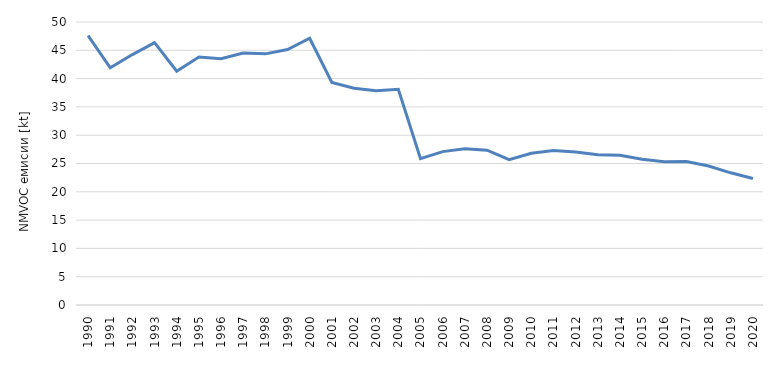
| Category | Series 0 |
|---|---|
| 1990.0 | 47.592 |
| 1991.0 | 41.908 |
| 1992.0 | 44.245 |
| 1993.0 | 46.352 |
| 1994.0 | 41.302 |
| 1995.0 | 43.832 |
| 1996.0 | 43.525 |
| 1997.0 | 44.525 |
| 1998.0 | 44.371 |
| 1999.0 | 45.133 |
| 2000.0 | 47.133 |
| 2001.0 | 39.307 |
| 2002.0 | 38.283 |
| 2003.0 | 37.852 |
| 2004.0 | 38.105 |
| 2005.0 | 25.856 |
| 2006.0 | 27.103 |
| 2007.0 | 27.622 |
| 2008.0 | 27.349 |
| 2009.0 | 25.686 |
| 2010.0 | 26.802 |
| 2011.0 | 27.313 |
| 2012.0 | 27.023 |
| 2013.0 | 26.539 |
| 2014.0 | 26.458 |
| 2015.0 | 25.767 |
| 2016.0 | 25.33 |
| 2017.0 | 25.343 |
| 2018.0 | 24.554 |
| 2019.0 | 23.353 |
| 2020.0 | 22.339 |